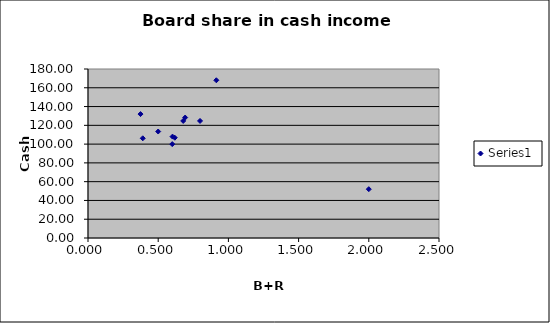
| Category | Series 0 |
|---|---|
| 2.0 | 52 |
| 0.914 | 168 |
| 0.6 | 100 |
| 0.798 | 124.68 |
| 0.678 | 124.68 |
| 0.692 | 128.28 |
| 0.618 | 106.8 |
| 0.374 | 132 |
| 0.5 | 113.4 |
| 0.39 | 106.2 |
| 0.602 | 108 |